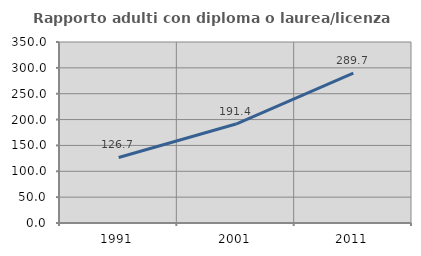
| Category | Rapporto adulti con diploma o laurea/licenza media  |
|---|---|
| 1991.0 | 126.704 |
| 2001.0 | 191.376 |
| 2011.0 | 289.702 |